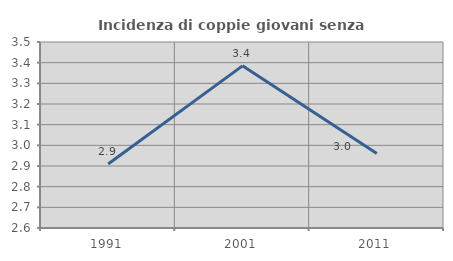
| Category | Incidenza di coppie giovani senza figli |
|---|---|
| 1991.0 | 2.91 |
| 2001.0 | 3.385 |
| 2011.0 | 2.961 |